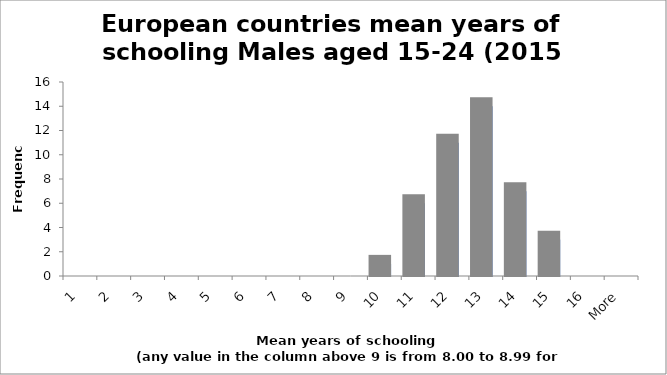
| Category | Frequency |
|---|---|
| 1 | 0 |
| 2 | 0 |
| 3 | 0 |
| 4 | 0 |
| 5 | 0 |
| 6 | 0 |
| 7 | 0 |
| 8 | 0 |
| 9 | 0 |
| 10 | 1 |
| 11 | 6 |
| 12 | 11 |
| 13 | 14 |
| 14 | 7 |
| 15 | 3 |
| 16 | 0 |
| More | 0 |